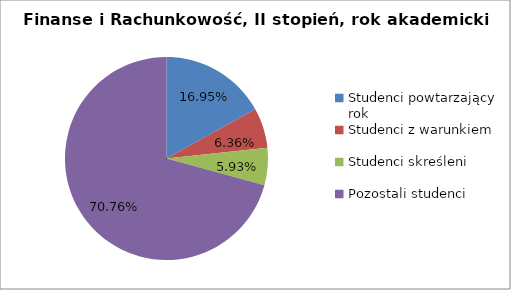
| Category | Series 0 |
|---|---|
| Studenci powtarzający rok | 40 |
| Studenci z warunkiem | 15 |
| Studenci skreśleni | 14 |
| Pozostali studenci | 167 |